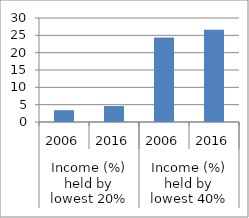
| Category | Series 0 |
|---|---|
| 0 | 3.4 |
| 1 | 4.6 |
| 2 | 24.4 |
| 3 | 26.6 |